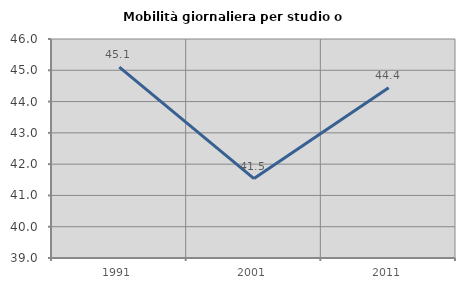
| Category | Mobilità giornaliera per studio o lavoro |
|---|---|
| 1991.0 | 45.098 |
| 2001.0 | 41.538 |
| 2011.0 | 44.444 |